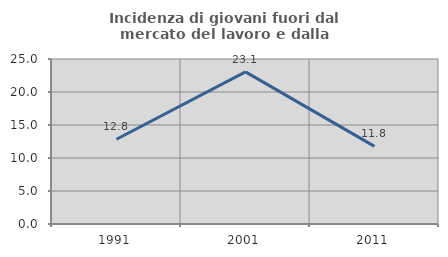
| Category | Incidenza di giovani fuori dal mercato del lavoro e dalla formazione  |
|---|---|
| 1991.0 | 12.834 |
| 2001.0 | 23.055 |
| 2011.0 | 11.765 |